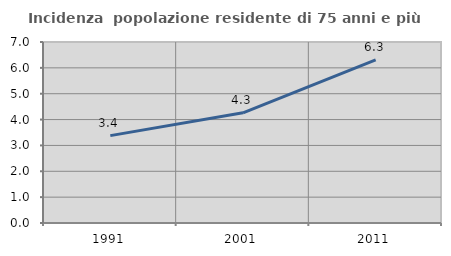
| Category | Incidenza  popolazione residente di 75 anni e più |
|---|---|
| 1991.0 | 3.38 |
| 2001.0 | 4.262 |
| 2011.0 | 6.305 |